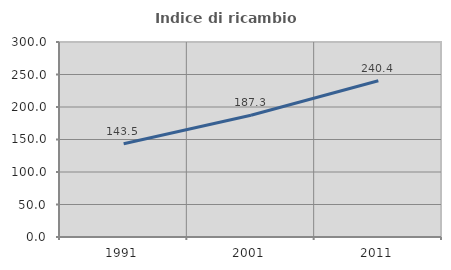
| Category | Indice di ricambio occupazionale  |
|---|---|
| 1991.0 | 143.548 |
| 2001.0 | 187.302 |
| 2011.0 | 240.441 |